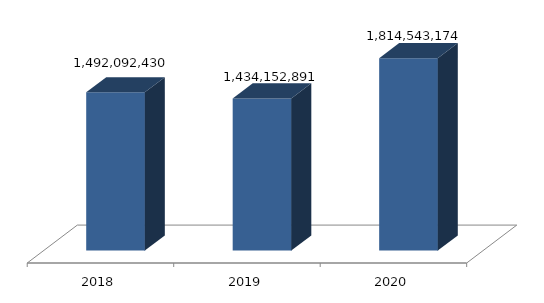
| Category | Series 0 |
|---|---|
| 0 | 1492092430 |
| 1 | 1434152891 |
| 2 | 1814543174 |